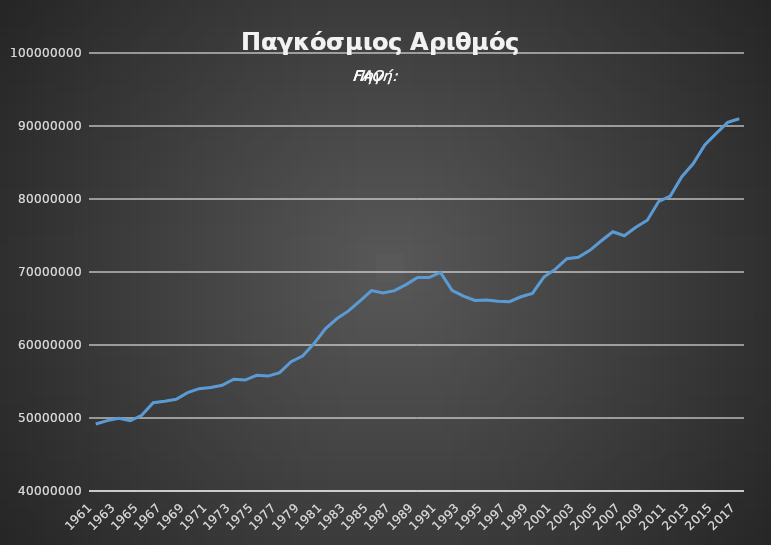
| Category | Παγκόσμια |
|---|---|
| 1961.0 | 49173473 |
| 1962.0 | 49639027 |
| 1963.0 | 49970283 |
| 1964.0 | 49625534 |
| 1965.0 | 50368109 |
| 1966.0 | 52083386 |
| 1967.0 | 52288194 |
| 1968.0 | 52573800 |
| 1969.0 | 53478677 |
| 1970.0 | 54019911 |
| 1971.0 | 54174200 |
| 1972.0 | 54482023 |
| 1973.0 | 55310535 |
| 1974.0 | 55195675 |
| 1975.0 | 55851124 |
| 1976.0 | 55740283 |
| 1977.0 | 56204567 |
| 1978.0 | 57706024 |
| 1979.0 | 58491794 |
| 1980.0 | 60198428 |
| 1981.0 | 62248861 |
| 1982.0 | 63622700 |
| 1983.0 | 64671383 |
| 1984.0 | 66060290 |
| 1985.0 | 67458523 |
| 1986.0 | 67129592 |
| 1987.0 | 67443256 |
| 1988.0 | 68277761 |
| 1989.0 | 69236607 |
| 1990.0 | 69237913 |
| 1991.0 | 69952217 |
| 1992.0 | 67491710 |
| 1993.0 | 66704017 |
| 1994.0 | 66102588 |
| 1995.0 | 66163866 |
| 1996.0 | 65992745 |
| 1997.0 | 65933672 |
| 1998.0 | 66607596 |
| 1999.0 | 67072126 |
| 2000.0 | 69300054 |
| 2001.0 | 70393523 |
| 2002.0 | 71829008 |
| 2003.0 | 72009100 |
| 2004.0 | 72973593 |
| 2005.0 | 74276467 |
| 2006.0 | 75517406 |
| 2007.0 | 74967203 |
| 2008.0 | 76119908 |
| 2009.0 | 77095057 |
| 2010.0 | 79683687 |
| 2011.0 | 80403600 |
| 2012.0 | 83058317 |
| 2013.0 | 84854694 |
| 2014.0 | 87414044 |
| 2015.0 | 88985408 |
| 2016.0 | 90493440 |
| 2017.0 | 90999730 |